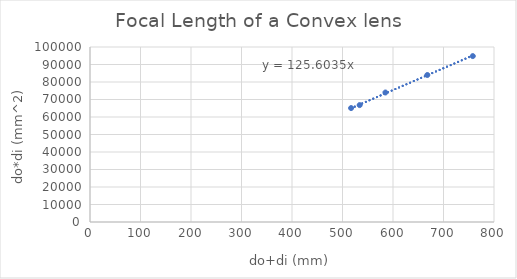
| Category | do*di (mm^2) |
|---|---|
| 534.0 | 66800 |
| 517.0 | 65100 |
| 585.0 | 74000 |
| 668.0 | 84000 |
| 758.0 | 94800 |